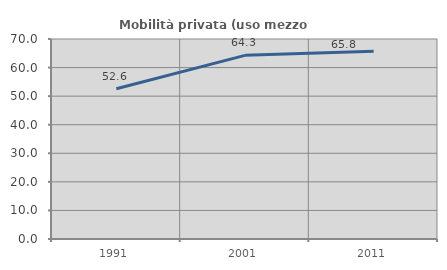
| Category | Mobilità privata (uso mezzo privato) |
|---|---|
| 1991.0 | 52.569 |
| 2001.0 | 64.271 |
| 2011.0 | 65.753 |